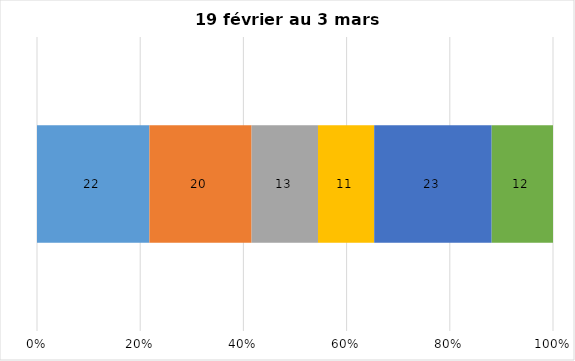
| Category | Plusieurs fois par jour | Une fois par jour | Quelques fois par semaine   | Une fois par semaine ou moins   |  Jamais   |  Je n’utilise pas les médias sociaux |
|---|---|---|---|---|---|---|
| 0 | 22 | 20 | 13 | 11 | 23 | 12 |